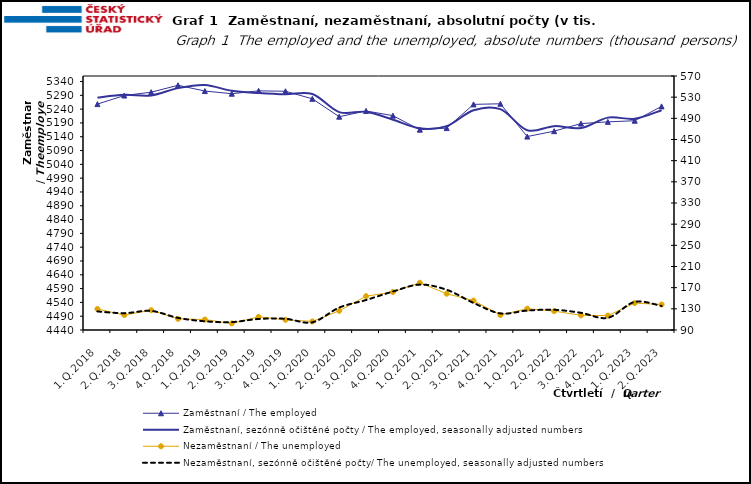
| Category | Zaměstnaní / The employed | Zaměstnaní, sezónně očištěné počty / The employed, seasonally adjusted numbers |
|---|---|---|
| 1.Q.2018 | 5258.225 | 5281.99 |
| 2.Q.2018 | 5289.242 | 5291.982 |
| 3.Q.2018 | 5301.361 | 5289.641 |
| 4.Q.2018 | 5326.327 | 5316.128 |
| 1.Q.2019 | 5305.534 | 5327.565 |
| 2.Q.2019 | 5295.929 | 5306.306 |
| 3.Q.2019 | 5306.247 | 5298.103 |
| 4.Q.2019 | 5304.7 | 5293.467 |
| 1.Q.2020 | 5277.418 | 5294.602 |
| 2.Q.2020 | 5212.593 | 5229.332 |
| 3.Q.2020 | 5233.335 | 5230.287 |
| 4.Q.2020 | 5216.403 | 5201.67 |
| 1.Q.2021 | 5165.582 | 5170.334 |
| 2.Q.2021 | 5171.264 | 5178.592 |
| 3.Q.2021 | 5257.199 | 5235.825 |
| 4.Q.2021 | 5259.43 | 5239.857 |
| 1.Q.2022 | 5140.696 | 5163.642 |
| 2.Q.2022 | 5160.173 | 5178.417 |
| 3.Q.2022 | 5187.626 | 5171.457 |
| 4.Q.2022 | 5193.945 | 5209.198 |
| 1.Q.2023 | 5198.026 | 5205.202 |
| 2.Q.2023 | 5249.908 | 5236.061 |